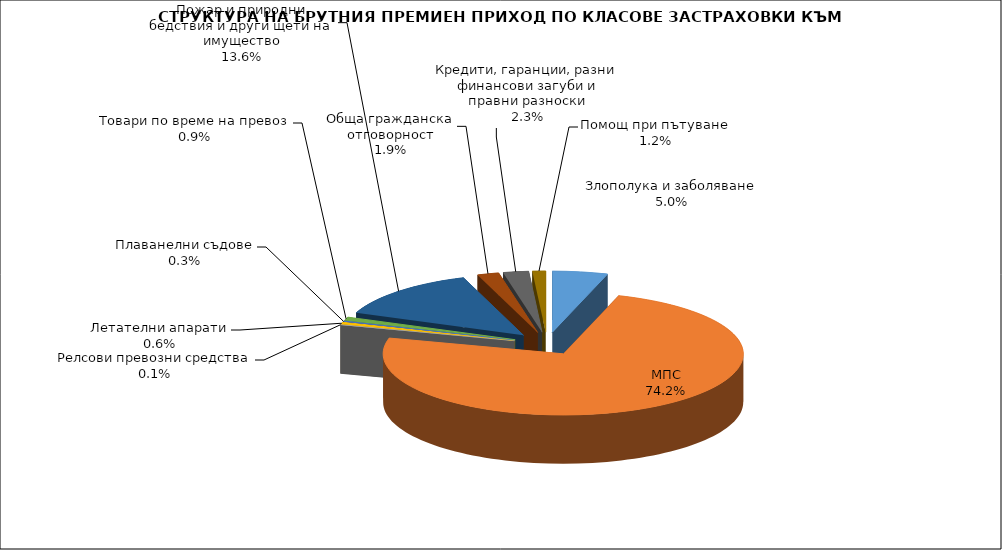
| Category | Злополука и заболяване |
|---|---|
| Злополука и заболяване | 0.05 |
| МПС | 0.742 |
| Релсови превозни средства | 0.001 |
| Летателни апарати | 0.006 |
| Плаванелни съдове | 0.003 |
| Товари по време на превоз | 0.009 |
| Пожар и природни бедствия и други щети на имущество | 0.136 |
| Обща гражданска отговорност | 0.019 |
| Кредити, гаранции, разни финансови загуби и правни разноски | 0.023 |
| Помощ при пътуване | 0.012 |